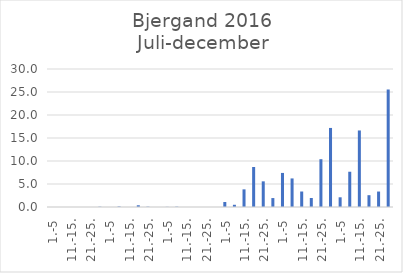
| Category | Series 0 |
|---|---|
| 1.-5 | 0 |
| 6.-10. | 0 |
| 11.-15. | 0 |
| 16.-20. | 0 |
| 21.-25. | 0 |
| 26.-31. | 0.063 |
| 1.-5 | 0 |
| 6.-10. | 0.11 |
| 11.-15. | 0 |
| 16.-20. | 0.375 |
| 21.-25. | 0.067 |
| 26.-31. | 0 |
| 1.-5 | 0.032 |
| 6.-10. | 0.07 |
| 11.-15. | 0 |
| 16.-20. | 0 |
| 21.-25. | 0 |
| 26.-30. | 0 |
| 1.-5 | 1.081 |
| 6.-10. | 0.482 |
| 11.-15. | 3.835 |
| 16.-20. | 8.699 |
| 21.-25. | 5.578 |
| 26.-31. | 1.942 |
| 1.-5 | 7.406 |
| 6.-10. | 6.211 |
| 11.-15. | 3.367 |
| 16.-20. | 1.961 |
| 21.-25. | 10.39 |
| 26.-30. | 17.186 |
| 1.-5 | 2.109 |
| 6.-10. | 7.667 |
| 11.-15. | 16.638 |
| 16.-20. | 2.568 |
| 21.-25. | 3.361 |
| 26.-31. | 25.544 |